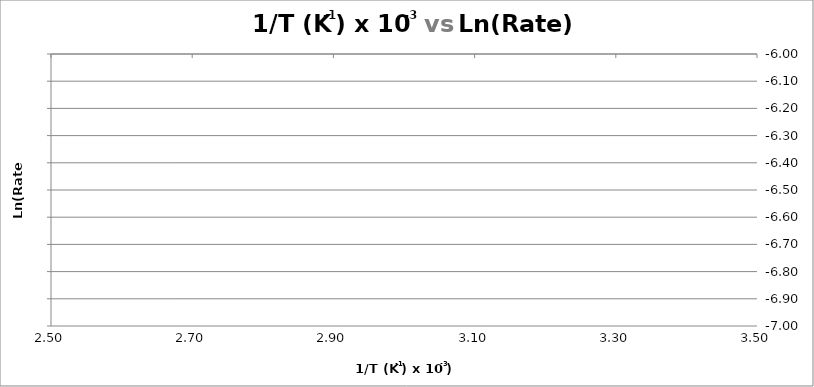
| Category | 1/T (K-1) x 10-3 |
|---|---|
| 0 | 0 |
| 1 | 0 |
| 2 | 0 |
| 3 | 0 |